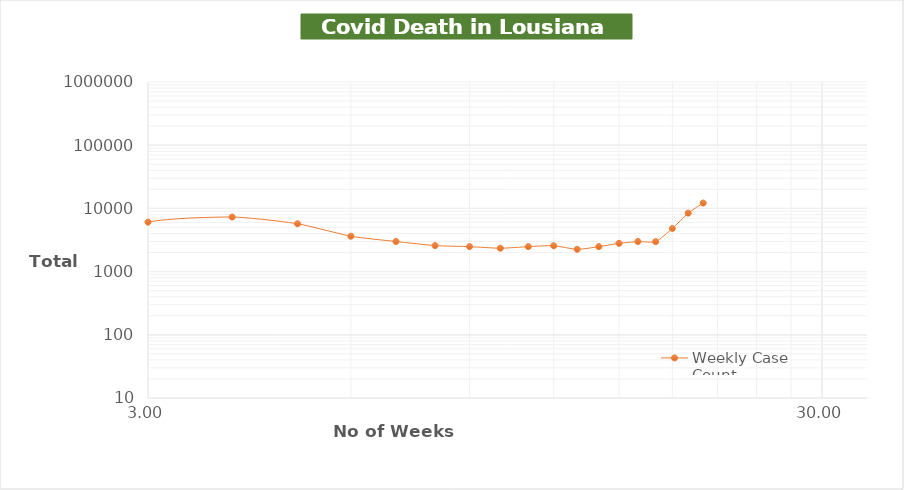
| Category | Weekly Case Count |
|---|---|
| 1.0 | 44 |
| 2.0 | 1667 |
| 3.0 | 6072 |
| 4.0 | 7303 |
| 5.0 | 5715 |
| 6.0 | 3628 |
| 7.0 | 2994 |
| 8.0 | 2579 |
| 9.0 | 2483 |
| 10.0 | 2344 |
| 11.0 | 2483 |
| 12.0 | 2565 |
| 13.0 | 2250 |
| 14.0 | 2483 |
| 15.0 | 2798 |
| 16.0 | 2994 |
| 17.0 | 2980 |
| 18.0 | 4814 |
| 19.0 | 8425 |
| 20.0 | 12141 |